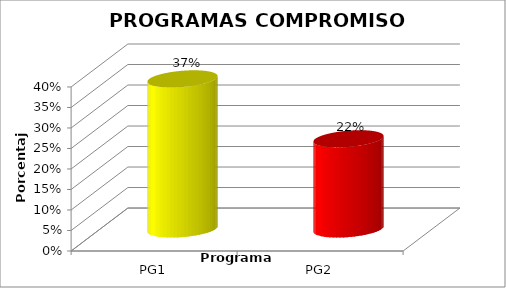
| Category | Series 0 |
|---|---|
| PG1 | 0.366 |
| PG2 | 0.22 |